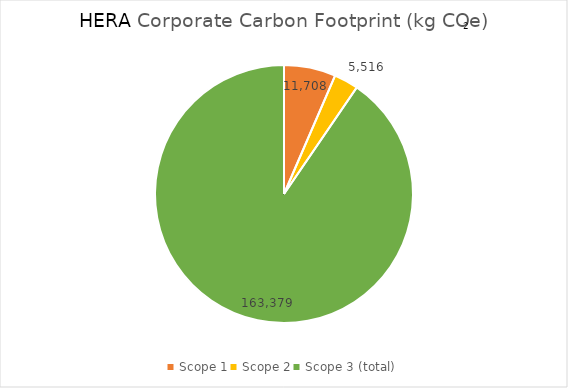
| Category | Series 0 |
|---|---|
| Scope 1 | 11708.051 |
| Scope 2 | 5515.703 |
| Scope 3 (total) | 163378.813 |